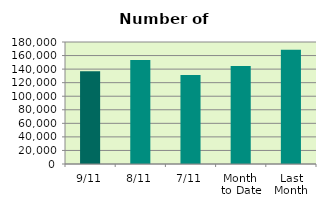
| Category | Series 0 |
|---|---|
| 9/11 | 136682 |
| 8/11 | 153582 |
| 7/11 | 131212 |
| Month 
to Date | 144760.571 |
| Last
Month | 168717.043 |